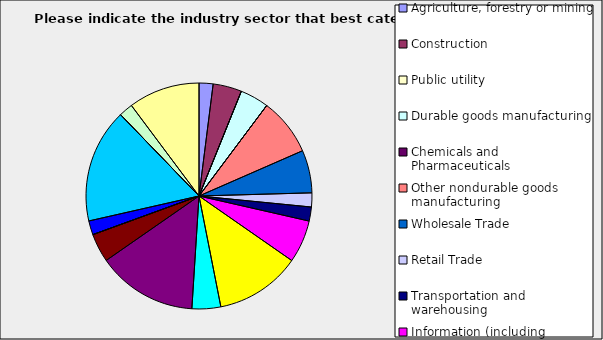
| Category | Series 0 |
|---|---|
| Agriculture, forestry or mining | 0.02 |
| Construction | 0.041 |
| Public utility | 0 |
| Durable goods manufacturing | 0.041 |
| Chemicals and Pharmaceuticals | 0 |
| Other nondurable goods manufacturing | 0.082 |
| Wholesale Trade | 0.061 |
| Retail Trade | 0.02 |
| Transportation and warehousing | 0.02 |
| Information (including broadcasting and telecommunication) | 0.061 |
| Finance and Insurance | 0.122 |
| Real Estate | 0.041 |
| Professional, scientific and technical services | 0.143 |
| Consulting | 0.041 |
| Administrative and office services (including waste management) | 0 |
| Education | 0.02 |
| Health Care and social services | 0.163 |
| Arts, entertainment and recreation | 0 |
| Accommodation and food services | 0.02 |
| Other | 0.102 |